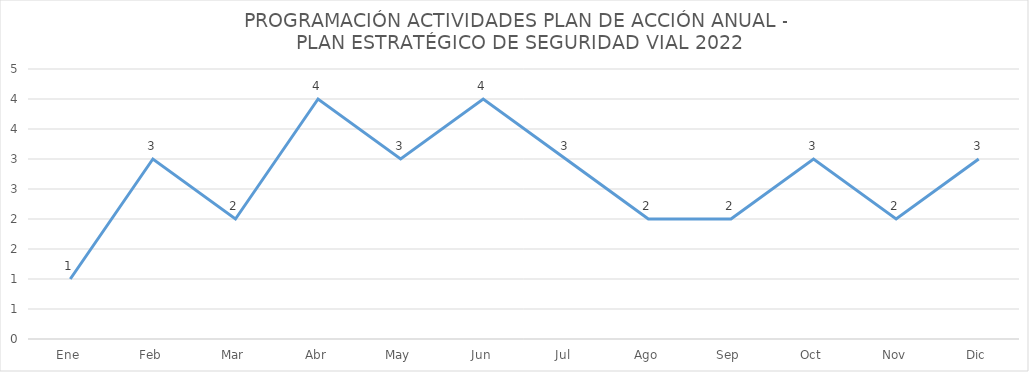
| Category | Series 0 |
|---|---|
| Ene | 1 |
| Feb | 3 |
| Mar | 2 |
| Abr | 4 |
| May | 3 |
| Jun | 4 |
| Jul | 3 |
| Ago | 2 |
| Sep | 2 |
| Oct | 3 |
| Nov | 2 |
| Dic | 3 |